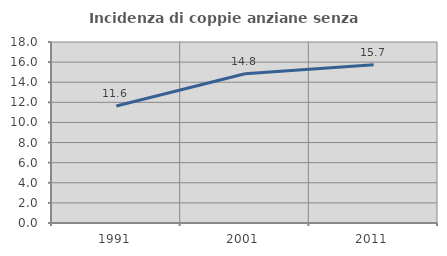
| Category | Incidenza di coppie anziane senza figli  |
|---|---|
| 1991.0 | 11.628 |
| 2001.0 | 14.844 |
| 2011.0 | 15.748 |